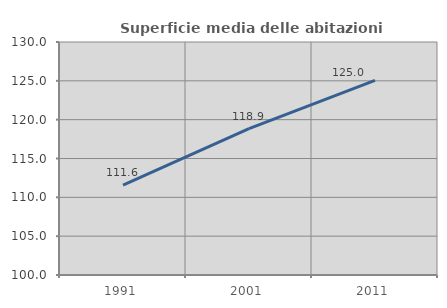
| Category | Superficie media delle abitazioni occupate |
|---|---|
| 1991.0 | 111.563 |
| 2001.0 | 118.858 |
| 2011.0 | 125.049 |